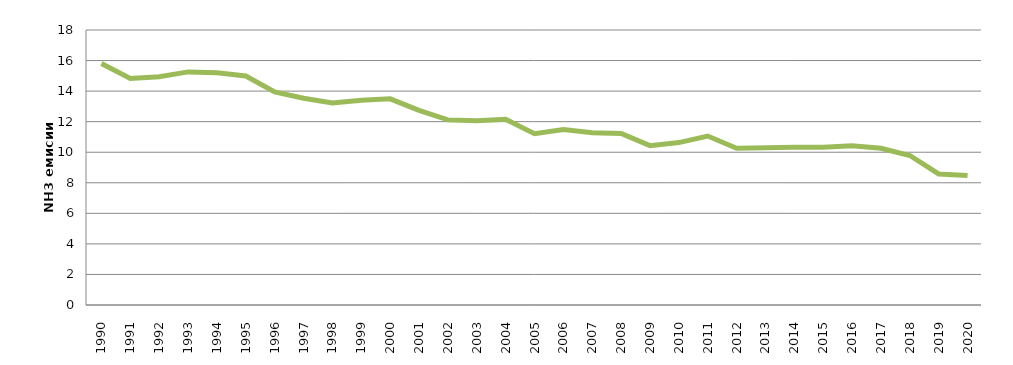
| Category | Series 2 |
|---|---|
| 1990.0 | 15.805 |
| 1991.0 | 14.83 |
| 1992.0 | 14.937 |
| 1993.0 | 15.257 |
| 1994.0 | 15.196 |
| 1995.0 | 14.991 |
| 1996.0 | 13.949 |
| 1997.0 | 13.534 |
| 1998.0 | 13.228 |
| 1999.0 | 13.407 |
| 2000.0 | 13.494 |
| 2001.0 | 12.735 |
| 2002.0 | 12.117 |
| 2003.0 | 12.06 |
| 2004.0 | 12.16 |
| 2005.0 | 11.214 |
| 2006.0 | 11.488 |
| 2007.0 | 11.278 |
| 2008.0 | 11.229 |
| 2009.0 | 10.43 |
| 2010.0 | 10.631 |
| 2011.0 | 11.058 |
| 2012.0 | 10.264 |
| 2013.0 | 10.294 |
| 2014.0 | 10.321 |
| 2015.0 | 10.322 |
| 2016.0 | 10.416 |
| 2017.0 | 10.258 |
| 2018.0 | 9.787 |
| 2019.0 | 8.576 |
| 2020.0 | 8.473 |